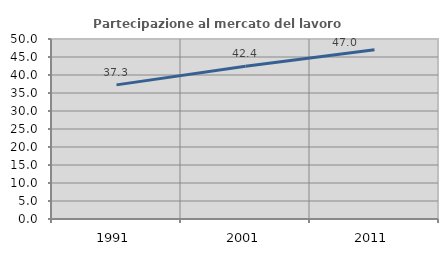
| Category | Partecipazione al mercato del lavoro  femminile |
|---|---|
| 1991.0 | 37.255 |
| 2001.0 | 42.448 |
| 2011.0 | 47.005 |